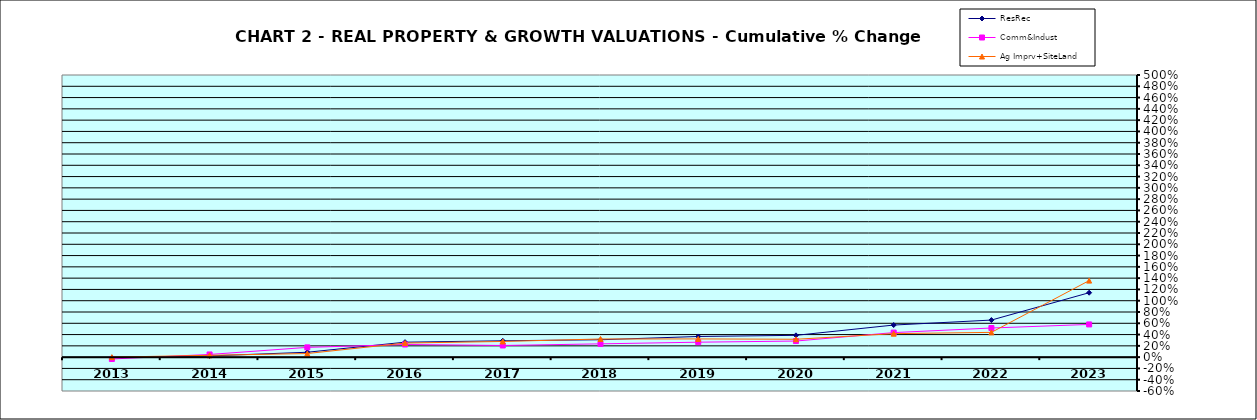
| Category | ResRec | Comm&Indust | Ag Imprv+SiteLand |
|---|---|---|---|
| 2013.0 | -0.008 | -0.032 | 0 |
| 2014.0 | 0.021 | 0.047 | 0.033 |
| 2015.0 | 0.087 | 0.173 | 0.064 |
| 2016.0 | 0.265 | 0.224 | 0.25 |
| 2017.0 | 0.29 | 0.207 | 0.278 |
| 2018.0 | 0.308 | 0.235 | 0.322 |
| 2019.0 | 0.366 | 0.265 | 0.323 |
| 2020.0 | 0.387 | 0.285 | 0.317 |
| 2021.0 | 0.569 | 0.435 | 0.416 |
| 2022.0 | 0.657 | 0.516 | 0.439 |
| 2023.0 | 1.142 | 0.58 | 1.356 |